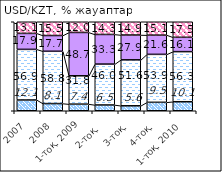
| Category | оң | әсер етпеді | теріс | білмеймін |
|---|---|---|---|---|
| 2007 | 12.068 | 56.895 | 17.94 | 13.095 |
| 2008 | 8.067 | 58.75 | 17.71 | 15.468 |
| 1-тоқ. 2009 | 7.44 | 31.84 | 48.69 | 12.03 |
| 2-тоқ.  | 6.48 | 45.96 | 33.28 | 14.28 |
| 3-тоқ. | 5.58 | 51.62 | 27.89 | 14.91 |
| 4-тоқ. | 9.48 | 53.89 | 21.58 | 15.05 |
| 1-тоқ. 2010  | 10.14 | 56.28 | 16.12 | 17.46 |